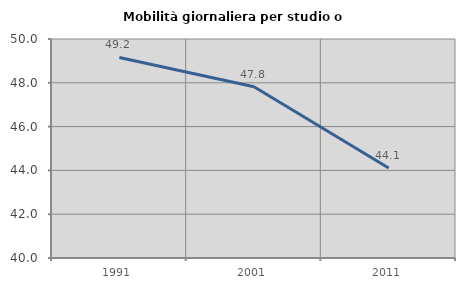
| Category | Mobilità giornaliera per studio o lavoro |
|---|---|
| 1991.0 | 49.158 |
| 2001.0 | 47.821 |
| 2011.0 | 44.109 |